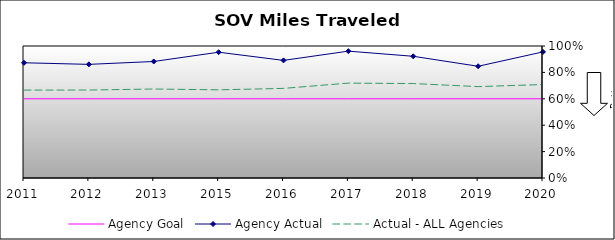
| Category | Agency Goal | Agency Actual | Actual - ALL Agencies |
|---|---|---|---|
| 2011.0 | 0.6 | 0.873 | 0.666 |
| 2012.0 | 0.6 | 0.861 | 0.666 |
| 2013.0 | 0.6 | 0.883 | 0.674 |
| 2015.0 | 0.6 | 0.953 | 0.668 |
| 2016.0 | 0.6 | 0.891 | 0.679 |
| 2017.0 | 0.6 | 0.961 | 0.719 |
| 2018.0 | 0.6 | 0.922 | 0.715 |
| 2019.0 | 0.6 | 0.846 | 0.692 |
| 2020.0 | 0.6 | 0.955 | 0.708 |